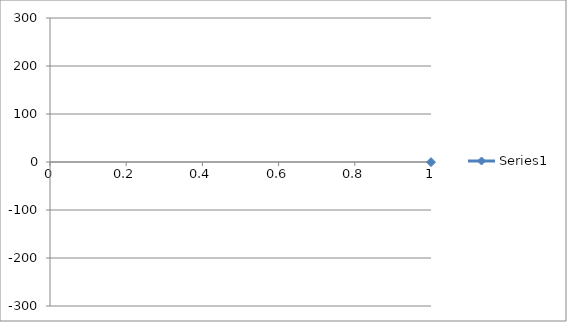
| Category | Series 0 |
|---|---|
| 0 | -0.295 |
| 1 | -0.309 |
| 2 | -0.333 |
| 3 | -0.374 |
| 4 | -0.414 |
| 5 | -0.454 |
| 6 | -0.5 |
| 7 | -0.543 |
| 8 | -0.589 |
| 9 | -0.651 |
| 10 | -0.717 |
| 11 | -0.803 |
| 12 | -0.888 |
| 13 | -0.981 |
| 14 | -1.103 |
| 15 | -1.223 |
| 16 | -1.391 |
| 17 | -1.584 |
| 18 | -1.782 |
| 19 | -2.045 |
| 20 | -2.354 |
| 21 | -2.711 |
| 22 | -3.159 |
| 23 | -3.705 |
| 24 | -4.356 |
| 25 | -5.212 |
| 26 | -6.767 |
| 27 | -8.172 |
| 28 | -9.867 |
| 29 | -12.607 |
| 30 | -15.496 |
| 31 | -17.088 |
| 32 | -18.786 |
| 33 | -20.623 |
| 34 | -22.997 |
| 35 | -25.517 |
| 36 | -28.152 |
| 37 | -31.053 |
| 38 | -34.026 |
| 39 | -38.156 |
| 40 | -42.293 |
| 41 | -46.729 |
| 42 | -52.076 |
| 43 | -57.705 |
| 44 | -64.189 |
| 45 | -71.197 |
| 46 | -78.654 |
| 47 | -87.419 |
| 48 | -96.667 |
| 49 | -105.882 |
| 50 | -116.235 |
| 51 | -126.817 |
| 52 | -137.562 |
| 53 | -149.054 |
| 54 | -159.489 |
| 55 | -170.638 |
| 56 | -181.256 |
| 57 | -191.194 |
| 58 | -200.494 |
| 59 | -208.86 |
| 60 | -216.262 |
| 61 | -222.012 |
| 62 | -226.304 |
| 63 | -229.005 |
| 64 | -230.296 |
| 65 | -230.016 |
| 66 | -227.371 |
| 67 | -223.238 |
| 68 | -216.467 |
| 69 | -208.216 |
| 70 | -198.258 |
| 71 | -185.607 |
| 72 | -170.966 |
| 73 | -154.529 |
| 74 | -135.911 |
| 75 | -116.069 |
| 76 | -94.249 |
| 77 | -71.853 |
| 78 | -48.286 |
| 79 | -23.826 |
| 80 | 1.371 |
| 81 | 26.157 |
| 82 | 49.876 |
| 83 | 74.079 |
| 84 | 96.845 |
| 85 | 118.433 |
| 86 | 137.518 |
| 87 | 156.033 |
| 88 | 172.307 |
| 89 | 185.96 |
| 90 | 198.373 |
| 91 | 208.403 |
| 92 | 216.826 |
| 93 | 222.879 |
| 94 | 227.063 |
| 95 | 229.45 |
| 96 | 229.759 |
| 97 | 229.175 |
| 98 | 225.664 |
| 99 | 221.434 |
| 100 | 215.6 |
| 101 | 207.8 |
| 102 | 199.589 |
| 103 | 190.354 |
| 104 | 180.131 |
| 105 | 169.687 |
| 106 | 158.836 |
| 107 | 147.805 |
| 108 | 136.298 |
| 109 | 125.778 |
| 110 | 115.075 |
| 111 | 105.295 |
| 112 | 95.827 |
| 113 | 86.346 |
| 114 | 78.641 |
| 115 | 70.878 |
| 116 | 63.798 |
| 117 | 57.507 |
| 118 | 51.967 |
| 119 | 47.259 |
| 120 | 42.43 |
| 121 | 38.148 |
| 122 | 34.538 |
| 123 | 31.202 |
| 124 | 28.362 |
| 125 | 25.619 |
| 126 | 23.306 |
| 127 | 21.482 |
| 128 | 19.736 |
| 129 | 17.874 |
| 130 | 16.338 |
| 131 | 13.288 |
| 132 | 10.604 |
| 133 | 8.956 |
| 134 | 7.39 |
| 135 | 6.065 |
| 136 | 5.491 |
| 137 | 4.811 |
| 138 | 4.128 |
| 139 | 3.584 |
| 140 | 3.112 |
| 141 | 2.716 |
| 142 | 2.413 |
| 143 | 2.133 |
| 144 | 1.912 |
| 145 | 1.69 |
| 146 | 1.529 |
| 147 | 1.391 |
| 148 | 1.265 |
| 149 | 1.169 |
| 150 | 1.072 |
| 151 | 1.003 |
| 152 | 0.934 |
| 153 | 0.881 |
| 154 | 0.822 |
| 155 | 0.787 |
| 156 | 0.742 |
| 157 | 0.71 |
| 158 | 0.653 |
| 159 | 0.638 |
| 160 | 0.615 |